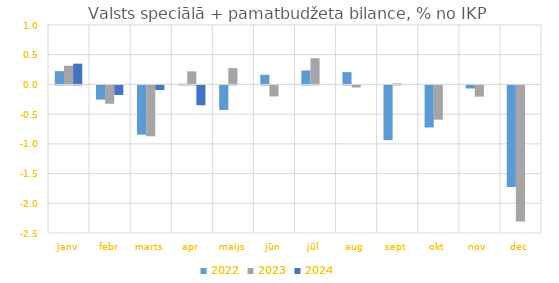
| Category | 2022 | 2023 | 2024 |
|---|---|---|---|
| janv | 0.224 | 0.315 | 0.349 |
| febr | -0.238 | -0.309 | -0.161 |
| marts | -0.828 | -0.856 | -0.077 |
| apr | 0.012 | 0.22 | -0.333 |
| maijs | -0.413 | 0.274 | 0 |
| jūn | 0.162 | -0.185 | 0 |
| jūl | 0.234 | 0.441 | 0 |
| aug | 0.207 | -0.035 | 0 |
| sept | -0.921 | 0.016 | 0 |
| okt | -0.707 | -0.576 | 0 |
| nov | -0.052 | -0.189 | 0 |
| dec | -1.707 | -2.289 | 0 |